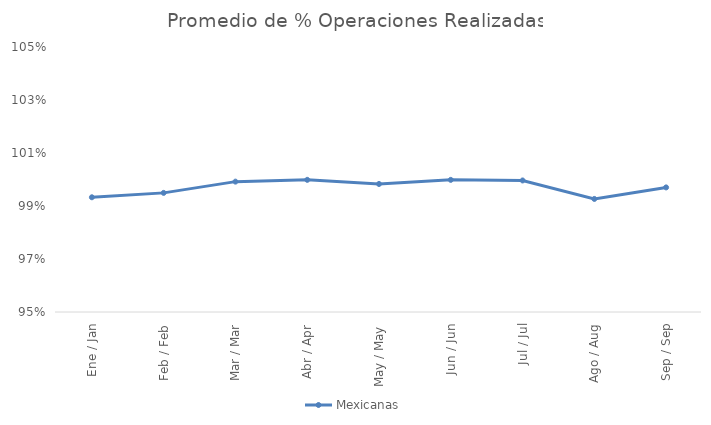
| Category | Mexicanas |
|---|---|
| Ene / Jan | 0.993 |
| Feb / Feb | 0.995 |
| Mar / Mar | 0.999 |
| Abr / Apr | 1 |
| May / May | 0.998 |
| Jun / Jun | 1 |
| Jul / Jul | 1 |
| Ago / Aug | 0.993 |
| Sep / Sep | 0.997 |